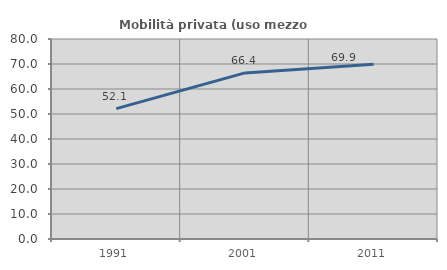
| Category | Mobilità privata (uso mezzo privato) |
|---|---|
| 1991.0 | 52.128 |
| 2001.0 | 66.447 |
| 2011.0 | 69.922 |